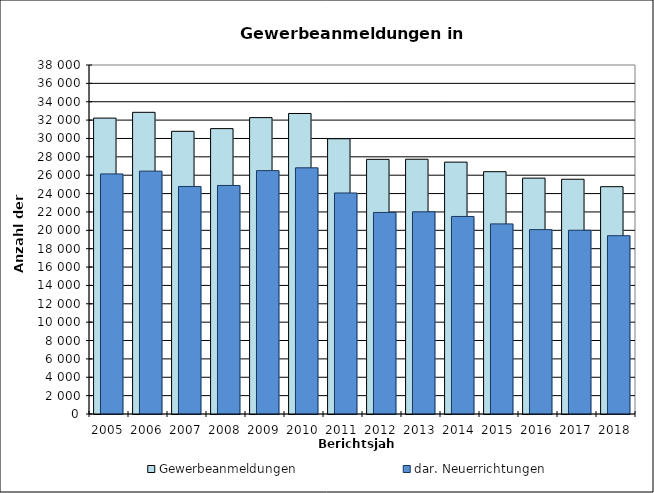
| Category | Gewerbeanmeldungen | dar. Neuerrichtungen |
|---|---|---|
| 2005.0 | 32219 | 26140 |
| 2006.0 | 32847 | 26444 |
| 2007.0 | 30781 | 24775 |
| 2008.0 | 31074 | 24884 |
| 2009.0 | 32271 | 26499 |
| 2010.0 | 32718 | 26806 |
| 2011.0 | 29971 | 24066 |
| 2012.0 | 27728 | 21948 |
| 2013.0 | 27739 | 22013 |
| 2014.0 | 27426 | 21509 |
| 2015.0 | 26383 | 20698 |
| 2016.0 | 25683 | 20075 |
| 2017.0 | 25561 | 20008 |
| 2018.0 | 24752 | 19413 |